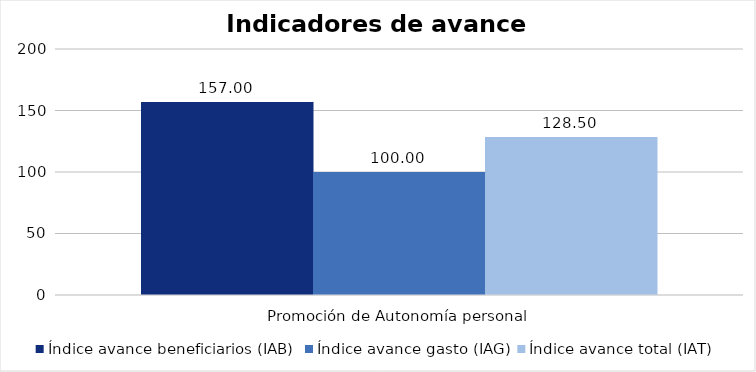
| Category | Índice avance beneficiarios (IAB)  | Índice avance gasto (IAG) | Índice avance total (IAT)  |
|---|---|---|---|
| Promoción de Autonomía personal  | 157 | 100 | 128.5 |